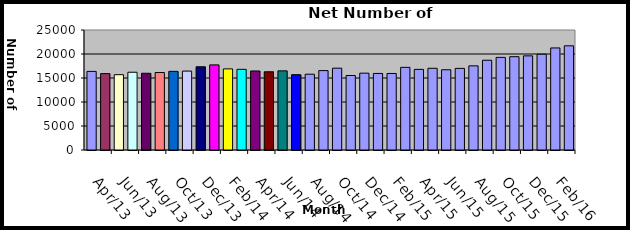
| Category | Series 0 |
|---|---|
| 2013-04-01 | 16376 |
| 2013-05-01 | 15916 |
| 2013-06-13 | 15687 |
| 2013-07-13 | 16200 |
| 2013-08-13 | 15984 |
| 2013-09-13 | 16140 |
| 2013-10-13 | 16381 |
| 2013-11-13 | 16442 |
| 2013-12-01 | 17338 |
| 2014-01-01 | 17732 |
| 2014-02-02 | 16896 |
| 2014-03-02 | 16804 |
| 2014-04-14 | 16462 |
| 2014-05-14 | 16298 |
| 2014-06-14 | 16488 |
| 2014-07-14 | 15689 |
| 2014-08-14 | 15788 |
| 2014-09-14 | 16541 |
| 2014-10-14 | 17045 |
| 2014-11-14 | 15521 |
| 2014-12-14 | 16006 |
| 2015-01-01 | 15950 |
| 2015-02-01 | 15941 |
| 2015-03-15 | 17219 |
| 2015-04-15 | 16796 |
| 2015-05-15 | 17023 |
| 2015-06-15 | 16718 |
| 2015-07-15 | 17003 |
| 2015-08-15 | 17531 |
| 2015-09-15 | 18700 |
| 2015-10-15 | 19295 |
| 2015-11-15 | 19438 |
| 2015-12-15 | 19612 |
| 2016-01-15 | 19953 |
| 2016-02-16 | 21262 |
| 2016-03-16 | 21707 |